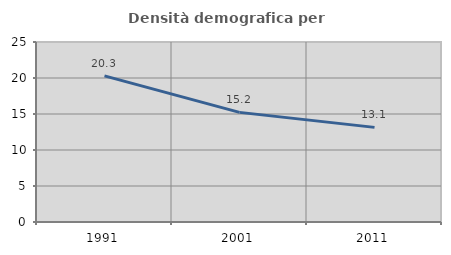
| Category | Densità demografica |
|---|---|
| 1991.0 | 20.299 |
| 2001.0 | 15.224 |
| 2011.0 | 13.142 |